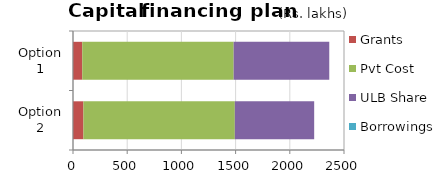
| Category | Grants | Pvt Cost | ULB Share | Borrowings |
|---|---|---|---|---|
| Option 2 | 96.3 | 1396.619 | 732 | 0 |
| Option 1 | 85.5 | 1396.619 | 882 | 0 |